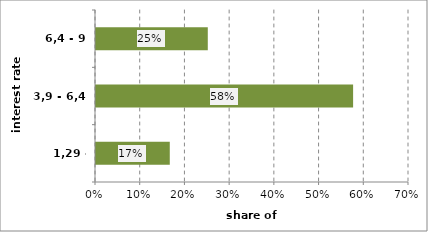
| Category | Series 0 |
|---|---|
| 1,29 - 3,9 | 0.165 |
| 3,9 - 6,4 | 0.575 |
| 6,4 - 9 | 0.25 |